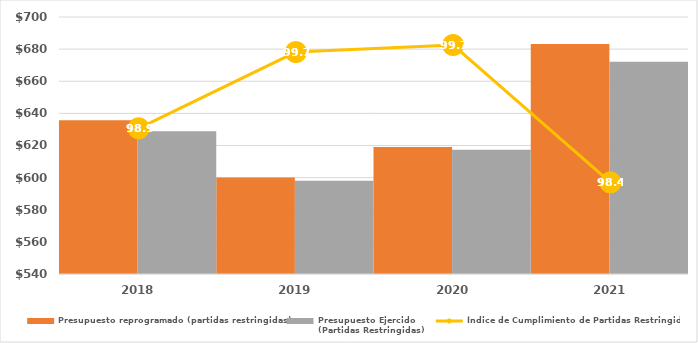
| Category | Presupuesto reprogramado (partidas restringidas) | Presupuesto Ejercido
(Partidas Restringidas) |
|---|---|---|
| 2018.0 | 635684.884 | 628799.563 |
| 2019.0 | 600089.527 | 598040.902 |
| 2020.0 | 619034.656 | 617347.742 |
| 2021.0 | 683166.418 | 672172.234 |